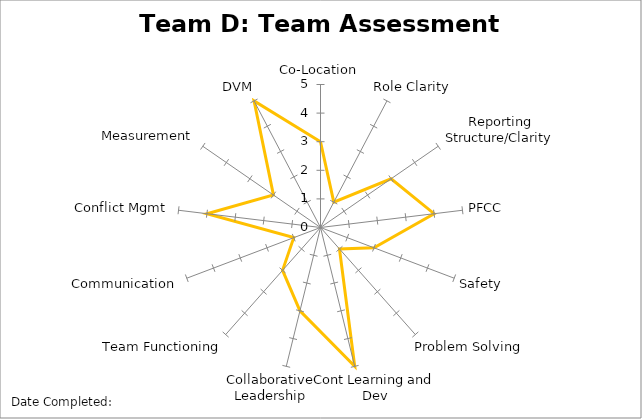
| Category | Series 0 |
|---|---|
| Co-Location | 3 |
| Role Clarity | 1 |
| Reporting Structure/Clarity | 3 |
| PFCC | 4 |
| Safety | 2 |
| Problem Solving | 1 |
| Cont Learning and Dev | 5 |
| Collaborative Leadership | 3 |
| Team Functioning | 2 |
| Communication | 1 |
| Conflict Mgmt | 4 |
| Measurement | 2 |
| DVM | 5 |